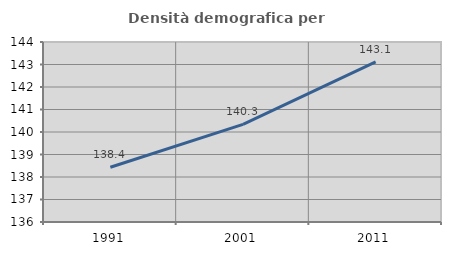
| Category | Densità demografica |
|---|---|
| 1991.0 | 138.434 |
| 2001.0 | 140.338 |
| 2011.0 | 143.114 |